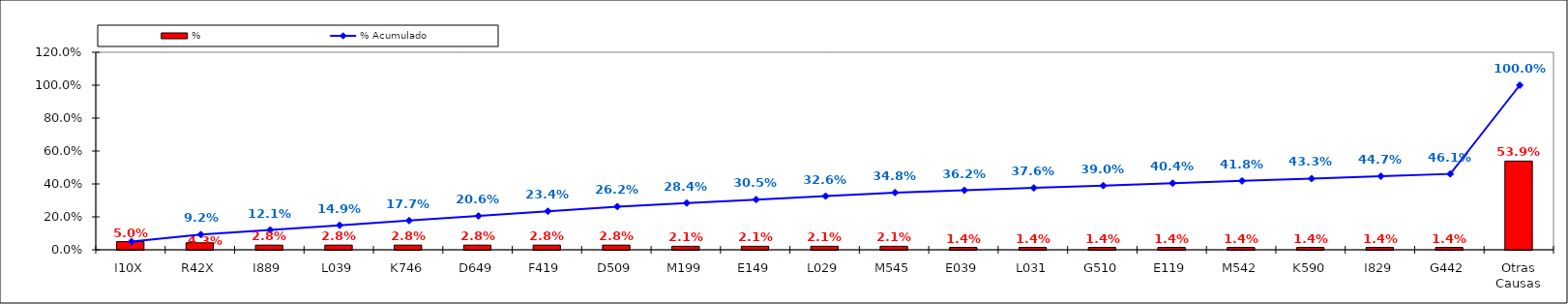
| Category | % |
|---|---|
| I10X | 0.05 |
| R42X | 0.043 |
| I889 | 0.028 |
| L039 | 0.028 |
| K746 | 0.028 |
| D649 | 0.028 |
| F419 | 0.028 |
| D509 | 0.028 |
| M199 | 0.021 |
| E149 | 0.021 |
| L029 | 0.021 |
| M545 | 0.021 |
| E039 | 0.014 |
| L031 | 0.014 |
| G510 | 0.014 |
| E119 | 0.014 |
| M542 | 0.014 |
| K590 | 0.014 |
| I829 | 0.014 |
| G442 | 0.014 |
| Otras Causas | 0.539 |